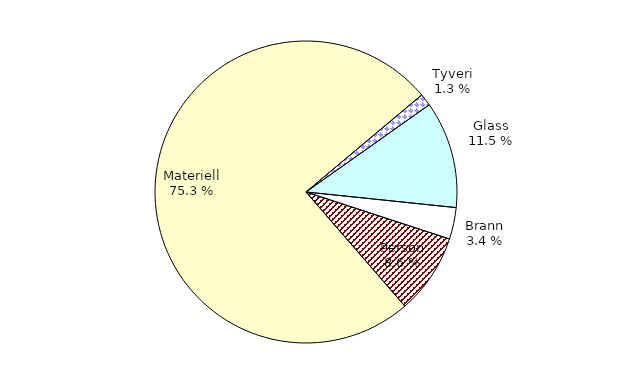
| Category | Series 0 |
|---|---|
| Tyveri | 101.866 |
| Glass | 892.475 |
| Brann | 264.169 |
| Person | 670.146 |
| Materiell | 5864.193 |